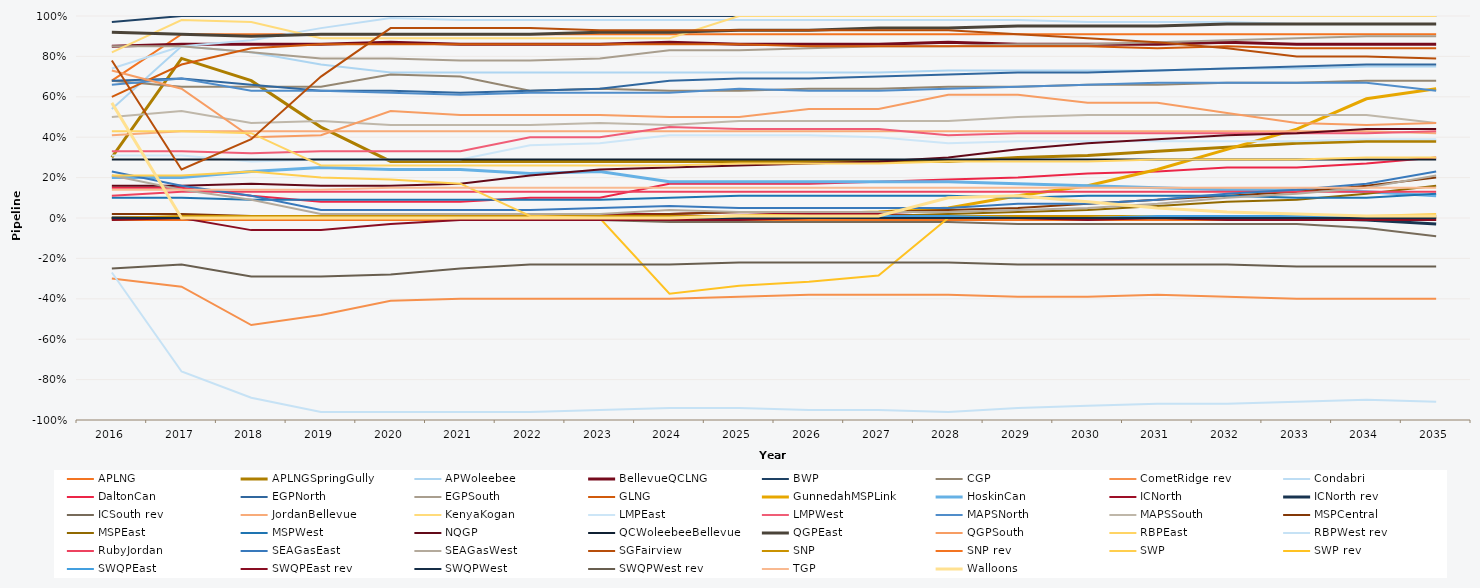
| Category | APLNG | APLNGSpringGully | APWoleebee | BellevueQCLNG | BWP | CGP | CometRidge rev | Condabri | DaltonCan | EGPNorth | EGPSouth | GLNG | GunnedahMSPLink | HoskinCan | ICNorth | ICNorth rev | ICSouth rev | JordanBellevue | KenyaKogan | LMPEast | LMPWest | MAPSNorth | MAPSSouth | MSPCentral | MSPEast | MSPWest | NQGP | QCWoleebeeBellevue | QGPEast | QGPSouth | RBPEast | RBPWest rev | RubyJordan | SEAGasEast | SEAGasWest | SGFairview | SNP | SNP rev | SWP | SWP rev | SWQPEast | SWQPEast rev | SWQPWest | SWQPWest rev | TGP | Walloons |
|---|---|---|---|---|---|---|---|---|---|---|---|---|---|---|---|---|---|---|---|---|---|---|---|---|---|---|---|---|---|---|---|---|---|---|---|---|---|---|---|---|---|---|---|---|---|---|
| 2016.0 | 0.68 | 0.3 | 0.54 | 0.85 | 0.97 | 0.68 | -0.3 | 0.74 | 0.15 | 0.68 | 0.85 | 0.6 | 0 | 0.2 | 0 | 0 | 0 | 0.41 | 0.82 | 0.31 | 0.33 | 0.66 | 0.5 | 0.02 | 0 | 0.1 | 0.16 | 0.29 | 0.92 | 0.73 | 0.43 | -0.27 | 0.11 | 0.23 | 0.21 | 0.78 | 0 | -0.01 | 0.21 | 0 | 0 | -0.01 | 0 | -0.25 | 0.14 | 0.57 |
| 2017.0 | 0.91 | 0.79 | 0.85 | 0.86 | 1 | 0.65 | -0.34 | 0.85 | 0.15 | 0.69 | 0.85 | 0.76 | 0 | 0.2 | 0 | 0 | 0 | 0.43 | 0.98 | 0.31 | 0.33 | 0.69 | 0.53 | 0.02 | 0 | 0.1 | 0.16 | 0.29 | 0.91 | 0.64 | 0.43 | -0.76 | 0.13 | 0.16 | 0.14 | 0.24 | 0.01 | -0.01 | 0.21 | 0 | 0 | 0 | 0 | -0.23 | 0.14 | 0 |
| 2018.0 | 0.91 | 0.68 | 0.82 | 0.86 | 1 | 0.65 | -0.53 | 0.88 | 0.11 | 0.66 | 0.82 | 0.84 | 0 | 0.23 | 0 | 0 | 0 | 0.43 | 0.97 | 0.28 | 0.32 | 0.63 | 0.47 | 0.01 | 0 | 0.09 | 0.17 | 0.29 | 0.9 | 0.4 | 0.42 | -0.89 | 0.13 | 0.11 | 0.09 | 0.39 | 0.01 | -0.01 | 0.23 | 0 | 0 | -0.06 | 0 | -0.29 | 0.14 | 0 |
| 2019.0 | 0.91 | 0.45 | 0.76 | 0.86 | 1 | 0.65 | -0.48 | 0.94 | 0.08 | 0.63 | 0.79 | 0.86 | 0 | 0.25 | 0 | 0 | 0 | 0.43 | 0.89 | 0.29 | 0.33 | 0.63 | 0.48 | 0.01 | 0 | 0.09 | 0.16 | 0.29 | 0.91 | 0.41 | 0.26 | -0.96 | 0.13 | 0.04 | 0.02 | 0.7 | 0.01 | -0.01 | 0.2 | 0 | 0 | -0.06 | 0 | -0.29 | 0.14 | 0 |
| 2020.0 | 0.91 | 0.28 | 0.72 | 0.87 | 1 | 0.71 | -0.41 | 0.99 | 0.08 | 0.63 | 0.79 | 0.86 | 0 | 0.24 | 0 | 0 | 0 | 0.43 | 0.89 | 0.29 | 0.33 | 0.62 | 0.46 | 0.01 | 0 | 0.09 | 0.16 | 0.29 | 0.91 | 0.53 | 0.26 | -0.96 | 0.13 | 0.04 | 0.02 | 0.94 | 0.01 | -0.01 | 0.19 | 0 | 0 | -0.03 | 0 | -0.28 | 0.15 | 0 |
| 2021.0 | 0.91 | 0.28 | 0.72 | 0.86 | 1 | 0.7 | -0.4 | 0.98 | 0.08 | 0.62 | 0.78 | 0.86 | 0 | 0.24 | 0 | 0 | 0 | 0.43 | 0.89 | 0.29 | 0.33 | 0.61 | 0.46 | 0.01 | 0 | 0.09 | 0.17 | 0.29 | 0.91 | 0.51 | 0.26 | -0.96 | 0.13 | 0.04 | 0.02 | 0.94 | 0.01 | -0.01 | 0.17 | 0 | 0 | -0.01 | 0 | -0.25 | 0.15 | 0 |
| 2022.0 | 0.91 | 0.28 | 0.72 | 0.86 | 1 | 0.63 | -0.4 | 0.98 | 0.1 | 0.63 | 0.78 | 0.86 | 0 | 0.22 | 0.01 | 0 | 0 | 0.43 | 0.89 | 0.36 | 0.4 | 0.62 | 0.46 | 0.01 | 0 | 0.09 | 0.21 | 0.29 | 0.91 | 0.51 | 0.26 | -0.96 | 0.13 | 0.04 | 0.02 | 0.94 | 0.01 | -0.01 | 0.01 | 0 | 0 | -0.01 | 0 | -0.23 | 0.15 | 0 |
| 2023.0 | 0.91 | 0.28 | 0.72 | 0.86 | 1 | 0.64 | -0.4 | 0.98 | 0.1 | 0.64 | 0.79 | 0.86 | 0 | 0.23 | 0.02 | 0 | -0.01 | 0.43 | 0.89 | 0.37 | 0.4 | 0.62 | 0.47 | 0.01 | 0 | 0.09 | 0.24 | 0.29 | 0.92 | 0.51 | 0.26 | -0.95 | 0.13 | 0.05 | 0.02 | 0.93 | 0.01 | -0.01 | 0 | 0 | 0 | -0.01 | 0 | -0.23 | 0.15 | 0 |
| 2024.0 | 0.91 | 0.28 | 0.72 | 0.87 | 1 | 0.63 | -0.4 | 0.98 | 0.17 | 0.68 | 0.83 | 0.86 | 0 | 0.18 | 0.02 | 0 | -0.02 | 0.43 | 0.89 | 0.41 | 0.45 | 0.62 | 0.46 | 0.02 | 0 | 0.1 | 0.25 | 0.29 | 0.92 | 0.5 | 0.26 | -0.94 | 0.13 | 0.06 | 0.04 | 0.93 | 0.01 | -0.01 | 0 | -0.375 | 0 | -0.01 | 0 | -0.23 | 0.15 | 0 |
| 2025.0 | 0.91 | 0.28 | 0.72 | 0.86 | 1 | 0.63 | -0.39 | 0.98 | 0.17 | 0.69 | 0.83 | 0.86 | 0.01 | 0.18 | 0.03 | 0 | -0.02 | 0.43 | 1 | 0.41 | 0.44 | 0.64 | 0.48 | 0.03 | 0.01 | 0.11 | 0.26 | 0.29 | 0.93 | 0.5 | 0.27 | -0.94 | 0.13 | 0.05 | 0.03 | 0.93 | 0.01 | -0.01 | 0 | -0.335 | 0.01 | -0.01 | 0 | -0.22 | 0.15 | 0.01 |
| 2026.0 | 0.91 | 0.28 | 0.72 | 0.86 | 1 | 0.64 | -0.38 | 0.98 | 0.17 | 0.69 | 0.84 | 0.85 | 0.02 | 0.18 | 0.02 | 0 | -0.02 | 0.43 | 1 | 0.41 | 0.44 | 0.63 | 0.48 | 0.03 | 0.01 | 0.11 | 0.27 | 0.29 | 0.93 | 0.54 | 0.27 | -0.95 | 0.13 | 0.05 | 0.03 | 0.93 | 0.01 | -0.01 | 0 | -0.315 | 0.01 | 0 | 0 | -0.22 | 0.15 | 0.01 |
| 2027.0 | 0.91 | 0.28 | 0.72 | 0.86 | 1 | 0.64 | -0.38 | 0.98 | 0.18 | 0.7 | 0.85 | 0.85 | 0.03 | 0.18 | 0.02 | 0 | -0.02 | 0.43 | 1 | 0.4 | 0.44 | 0.63 | 0.48 | 0.03 | 0.01 | 0.11 | 0.28 | 0.29 | 0.94 | 0.54 | 0.27 | -0.95 | 0.13 | 0.05 | 0.03 | 0.93 | 0.01 | -0.01 | 0 | -0.285 | 0.01 | 0 | 0 | -0.22 | 0.15 | 0.01 |
| 2028.0 | 0.91 | 0.28 | 0.73 | 0.87 | 1 | 0.65 | -0.38 | 0.98 | 0.19 | 0.71 | 0.85 | 0.85 | 0.05 | 0.18 | 0.01 | 0 | -0.02 | 0.43 | 1 | 0.37 | 0.41 | 0.64 | 0.48 | 0.04 | 0.02 | 0.11 | 0.3 | 0.29 | 0.94 | 0.61 | 0.28 | -0.96 | 0.13 | 0.05 | 0.03 | 0.93 | 0.01 | -0.01 | 0 | 0 | 0.01 | 0 | 0 | -0.22 | 0.15 | 0.1 |
| 2029.0 | 0.91 | 0.3 | 0.73 | 0.86 | 1 | 0.65 | -0.39 | 0.98 | 0.2 | 0.72 | 0.86 | 0.85 | 0.11 | 0.17 | 0 | 0 | -0.03 | 0.43 | 1 | 0.38 | 0.42 | 0.65 | 0.5 | 0.05 | 0.03 | 0.1 | 0.34 | 0.29 | 0.95 | 0.61 | 0.28 | -0.94 | 0.13 | 0.07 | 0.04 | 0.91 | 0.01 | -0.01 | 0 | 0 | 0 | 0 | 0 | -0.23 | 0.15 | 0.11 |
| 2030.0 | 0.91 | 0.31 | 0.73 | 0.86 | 1 | 0.66 | -0.39 | 0.97 | 0.22 | 0.72 | 0.86 | 0.85 | 0.16 | 0.16 | 0 | 0 | -0.03 | 0.43 | 1 | 0.38 | 0.42 | 0.66 | 0.51 | 0.07 | 0.04 | 0.11 | 0.37 | 0.29 | 0.95 | 0.57 | 0.28 | -0.93 | 0.13 | 0.07 | 0.05 | 0.89 | 0.01 | -0.01 | 0 | 0 | 0 | -0.01 | 0 | -0.23 | 0.15 | 0.08 |
| 2031.0 | 0.91 | 0.33 | 0.73 | 0.86 | 1 | 0.66 | -0.38 | 0.97 | 0.23 | 0.73 | 0.87 | 0.84 | 0.24 | 0.15 | 0 | 0 | -0.03 | 0.43 | 1 | 0.38 | 0.42 | 0.67 | 0.51 | 0.09 | 0.06 | 0.11 | 0.39 | 0.29 | 0.95 | 0.57 | 0.29 | -0.92 | 0.13 | 0.09 | 0.07 | 0.87 | 0.01 | -0.01 | 0.01 | 0 | 0.01 | 0 | 0 | -0.23 | 0.15 | 0.05 |
| 2032.0 | 0.91 | 0.35 | 0.74 | 0.87 | 1 | 0.67 | -0.39 | 0.97 | 0.25 | 0.74 | 0.88 | 0.85 | 0.34 | 0.14 | 0 | 0 | -0.03 | 0.43 | 1 | 0.38 | 0.42 | 0.67 | 0.51 | 0.11 | 0.08 | 0.11 | 0.41 | 0.29 | 0.96 | 0.52 | 0.29 | -0.92 | 0.13 | 0.12 | 0.1 | 0.84 | 0.01 | -0.01 | 0.01 | 0 | 0.01 | -0.01 | 0 | -0.23 | 0.15 | 0.03 |
| 2033.0 | 0.91 | 0.37 | 0.74 | 0.86 | 1 | 0.67 | -0.4 | 0.96 | 0.25 | 0.75 | 0.89 | 0.84 | 0.44 | 0.14 | 0 | 0 | -0.03 | 0.43 | 1 | 0.38 | 0.42 | 0.67 | 0.51 | 0.13 | 0.09 | 0.1 | 0.42 | 0.29 | 0.96 | 0.47 | 0.29 | -0.91 | 0.13 | 0.14 | 0.12 | 0.8 | 0.01 | -0.01 | 0.01 | 0 | 0.01 | -0.01 | 0 | -0.24 | 0.15 | 0.02 |
| 2034.0 | 0.91 | 0.38 | 0.75 | 0.86 | 1 | 0.68 | -0.4 | 0.96 | 0.27 | 0.76 | 0.9 | 0.84 | 0.59 | 0.13 | 0 | -0.01 | -0.05 | 0.43 | 1 | 0.39 | 0.42 | 0.67 | 0.51 | 0.16 | 0.12 | 0.1 | 0.44 | 0.29 | 0.96 | 0.46 | 0.3 | -0.9 | 0.13 | 0.17 | 0.15 | 0.8 | 0.01 | -0.01 | 0.01 | 0 | 0.01 | -0.01 | 0 | -0.24 | 0.15 | 0.01 |
| 2035.0 | 0.91 | 0.38 | 0.75 | 0.86 | 1 | 0.68 | -0.4 | 0.96 | 0.3 | 0.76 | 0.9 | 0.84 | 0.64 | 0.11 | 0 | -0.03 | -0.09 | 0.42 | 1 | 0.39 | 0.43 | 0.63 | 0.47 | 0.2 | 0.16 | 0.12 | 0.44 | 0.29 | 0.96 | 0.47 | 0.3 | -0.91 | 0.13 | 0.23 | 0.21 | 0.79 | 0.01 | -0.01 | 0.02 | 0 | 0.01 | -0.01 | 0 | -0.24 | 0.15 | 0.01 |